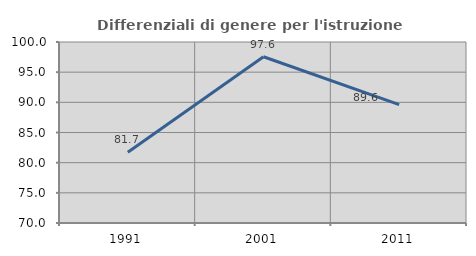
| Category | Differenziali di genere per l'istruzione superiore |
|---|---|
| 1991.0 | 81.716 |
| 2001.0 | 97.554 |
| 2011.0 | 89.607 |